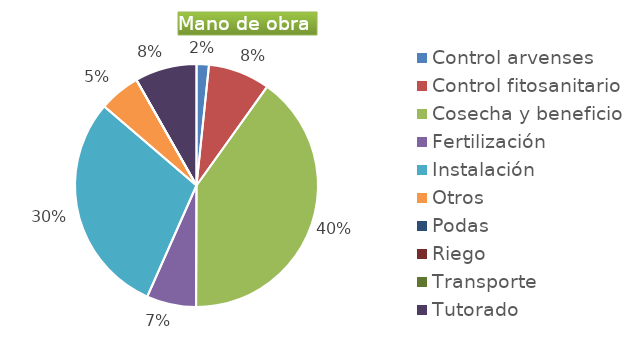
| Category | Series 0 |
|---|---|
| Control arvenses | 102270 |
| Control fitosanitario | 511350 |
| Cosecha y beneficio | 2495400 |
| Fertilización | 409080 |
| Instalación | 1840860 |
| Otros | 340900 |
| Podas | 0 |
| Riego | 0 |
| Transporte | 0 |
| Tutorado | 511350 |